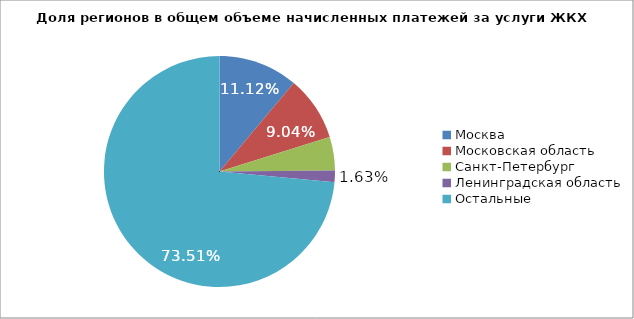
| Category | Начсилено |
|---|---|
| Москва  | 292.8 |
| Московская область | 237.8 |
| Санкт-Петербург  | 123.8 |
| Ленинградская область | 42.8 |
| Остальные  | 1934.8 |